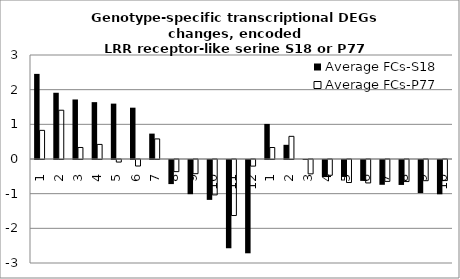
| Category | Average FCs-S18 | Average FCs-P77 |
|---|---|---|
| 1.0 | 2.455 | 0.826 |
| 2.0 | 1.911 | 1.407 |
| 3.0 | 1.717 | 0.332 |
| 4.0 | 1.64 | 0.421 |
| 5.0 | 1.597 | -0.074 |
| 6.0 | 1.48 | -0.188 |
| 7.0 | 0.732 | 0.58 |
| 8.0 | -0.695 | -0.35 |
| 9.0 | -0.986 | -0.409 |
| 10.0 | -1.15 | -1.021 |
| 11.0 | -2.546 | -1.616 |
| 12.0 | -2.691 | -0.191 |
| 1.0 | 1.012 | 0.332 |
| 2.0 | 0.409 | 0.654 |
| 3.0 | 0 | -0.414 |
| 4.0 | -0.484 | -0.455 |
| 5.0 | -0.489 | -0.664 |
| 6.0 | -0.602 | -0.676 |
| 7.0 | -0.715 | -0.631 |
| 8.0 | -0.72 | -0.636 |
| 9.0 | -0.956 | -0.612 |
| 10.0 | -0.989 | -0.608 |